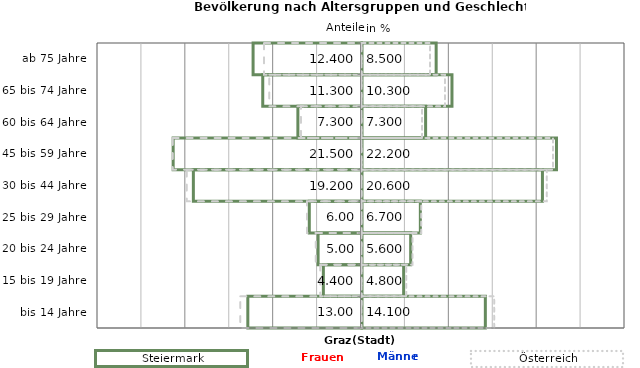
| Category | Frauen Spalte2 | Männer Spalte2 | Frauen Spalte3 | Männer Spalte3 |
|---|---|---|---|---|
| bis 14 Jahre | 14.1 | -13 | -13.8 | 15.1 |
| 15 bis 19 Jahre | 4.8 | -4.4 | -4.7 | 5.1 |
| 20 bis 24 Jahre | 5.6 | -5 | -5.2 | 5.8 |
| 25 bis 29 Jahre | 6.7 | -6 | -6.2 | 6.8 |
| 30 bis 44 Jahre | 20.6 | -19.2 | -19.9 | 21.1 |
| 45 bis 59 Jahre | 22.2 | -21.5 | -21.5 | 21.8 |
| 60 bis 64 Jahre | 7.3 | -7.3 | -6.9 | 6.9 |
| 65 bis 74 Jahre | 10.3 | -11.3 | -10.5 | 9.5 |
| ab 75 Jahre | 8.5 | -12.4 | -11.1 | 7.8 |